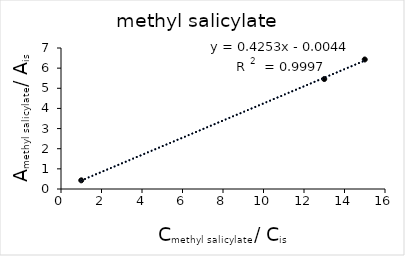
| Category | Series 0 |
|---|---|
| 1.0 | 0.43 |
| 13.0 | 5.46 |
| 15.0 | 6.429 |